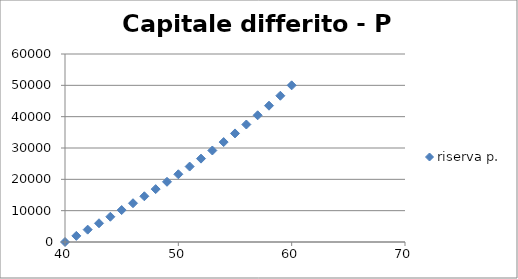
| Category | riserva p. |
|---|---|
| 40.0 | 0 |
| 41.0 | 1950.503 |
| 42.0 | 3943.16 |
| 43.0 | 5979.471 |
| 44.0 | 8060.905 |
| 45.0 | 10189.622 |
| 46.0 | 12367.364 |
| 47.0 | 14595.877 |
| 48.0 | 16879.03 |
| 49.0 | 19218.018 |
| 50.0 | 21616.092 |
| 51.0 | 24076.951 |
| 52.0 | 26605.642 |
| 53.0 | 29205.858 |
| 54.0 | 31889.014 |
| 55.0 | 34649.342 |
| 56.0 | 37496.714 |
| 57.0 | 40442.089 |
| 58.0 | 43502.215 |
| 59.0 | 46679.677 |
| 60.0 | 50000 |